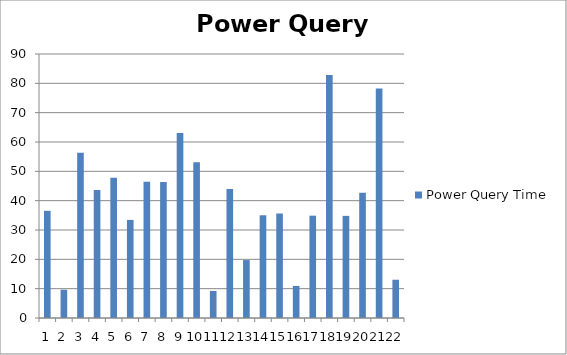
| Category | Power Query Time |
|---|---|
| 0 | 36.544 |
| 1 | 9.646 |
| 2 | 56.345 |
| 3 | 43.643 |
| 4 | 47.821 |
| 5 | 33.444 |
| 6 | 46.469 |
| 7 | 46.375 |
| 8 | 63.072 |
| 9 | 53.078 |
| 10 | 9.227 |
| 11 | 43.953 |
| 12 | 19.749 |
| 13 | 35.022 |
| 14 | 35.619 |
| 15 | 10.942 |
| 16 | 34.889 |
| 17 | 82.864 |
| 18 | 34.815 |
| 19 | 42.694 |
| 20 | 78.218 |
| 21 | 13.046 |